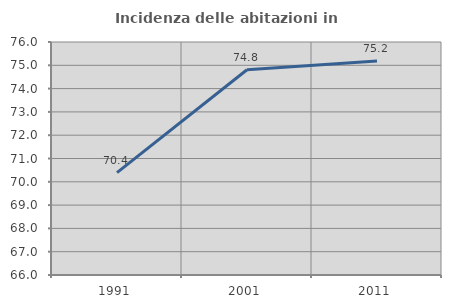
| Category | Incidenza delle abitazioni in proprietà  |
|---|---|
| 1991.0 | 70.395 |
| 2001.0 | 74.809 |
| 2011.0 | 75.19 |